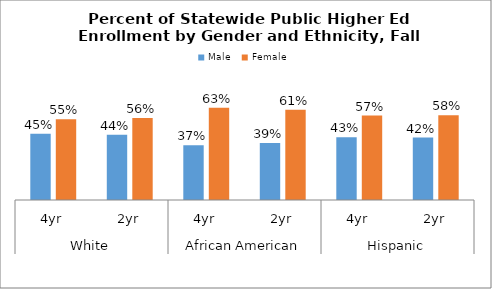
| Category | Male | Female |
|---|---|---|
| 0 | 0.451 | 0.549 |
| 1 | 0.443 | 0.557 |
| 2 | 0.373 | 0.627 |
| 3 | 0.387 | 0.613 |
| 4 | 0.426 | 0.574 |
| 5 | 0.424 | 0.576 |